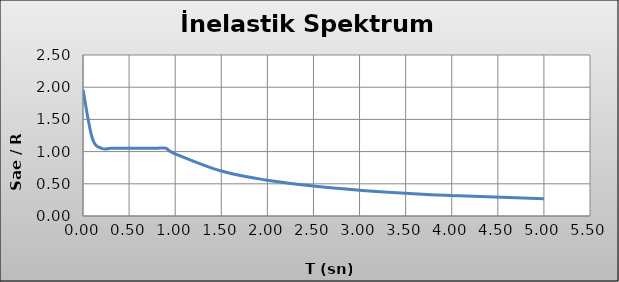
| Category | Series 0 |
|---|---|
| 0.0 | 1.962 |
| 0.1 | 1.212 |
| 0.2 | 1.051 |
| 0.3 | 1.051 |
| 0.4 | 1.051 |
| 0.5 | 1.051 |
| 0.6 | 1.051 |
| 0.7 | 1.051 |
| 0.8 | 1.051 |
| 0.9 | 1.051 |
| 1.0 | 0.966 |
| 1.5 | 0.698 |
| 2.0 | 0.555 |
| 2.5 | 0.464 |
| 3.0 | 0.401 |
| 3.5 | 0.355 |
| 4.0 | 0.319 |
| 5.0 | 0.267 |